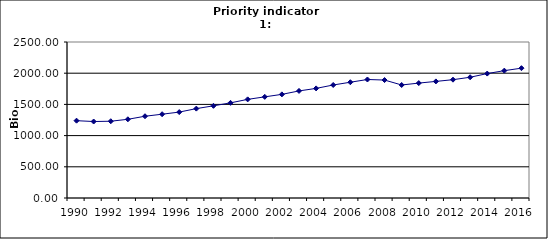
| Category | GDP, Bio Euro (EC95) |
|---|---|
| 1990 | 1239.155 |
| 1991 | 1225.691 |
| 1992 | 1230.275 |
| 1993 | 1261.363 |
| 1994 | 1310.304 |
| 1995 | 1342.665 |
| 1996 | 1376.751 |
| 1997 | 1432.348 |
| 1998 | 1477.292 |
| 1999 | 1524.812 |
| 2000 | 1580.684 |
| 2001 | 1620.898 |
| 2002 | 1660.738 |
| 2003 | 1715.972 |
| 2004 | 1756.546 |
| 2005 | 1810.93 |
| 2006 | 1855.407 |
| 2007 | 1899.133 |
| 2008 | 1890.159 |
| 2009 | 1811.004 |
| 2010 | 1841.692 |
| 2011 | 1868.445 |
| 2012 | 1896.123 |
| 2013 | 1935.038 |
| 2014 | 1994.139 |
| 2015 | 2040.921 |
| 2016 | 2080.429 |